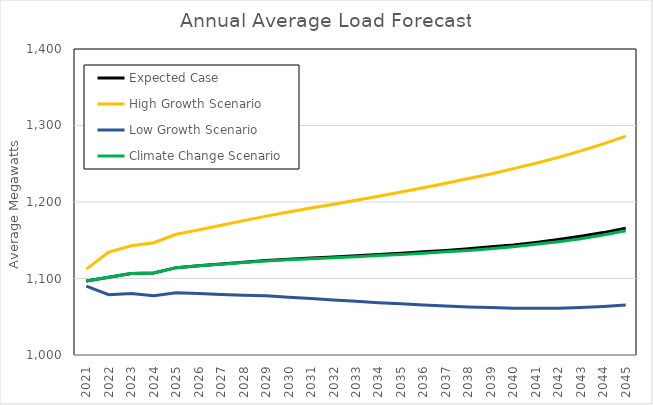
| Category | Expected Case | High Growth Scenario | Low Growth Scenario | Climate Change Scenario |
|---|---|---|---|---|
| 2021.0 | 1096.605 | 1112.304 | 1089.926 | 1096.605 |
| 2022.0 | 1101.688 | 1134.468 | 1078.847 | 1101.688 |
| 2023.0 | 1106.436 | 1142.803 | 1080.266 | 1106.436 |
| 2024.0 | 1107.288 | 1146.797 | 1077.345 | 1107.288 |
| 2025.0 | 1114.175 | 1157.879 | 1081.427 | 1114.175 |
| 2026.0 | 1116.586 | 1163.548 | 1080.351 | 1116.567 |
| 2027.0 | 1118.841 | 1169.551 | 1079.181 | 1118.652 |
| 2028.0 | 1121.088 | 1175.63 | 1078.263 | 1120.904 |
| 2029.0 | 1123.668 | 1181.551 | 1077.345 | 1122.989 |
| 2030.0 | 1125.175 | 1186.797 | 1075.515 | 1124.499 |
| 2031.0 | 1126.671 | 1192.129 | 1073.764 | 1125.833 |
| 2032.0 | 1128.167 | 1197.129 | 1072.016 | 1127.085 |
| 2033.0 | 1129.751 | 1202.378 | 1070.268 | 1128.422 |
| 2034.0 | 1131.252 | 1207.625 | 1068.433 | 1130.093 |
| 2035.0 | 1132.921 | 1213.041 | 1067.099 | 1131.427 |
| 2036.0 | 1134.836 | 1218.625 | 1065.348 | 1133.099 |
| 2037.0 | 1136.751 | 1224.46 | 1064.101 | 1134.94 |
| 2038.0 | 1138.915 | 1230.622 | 1062.849 | 1136.688 |
| 2039.0 | 1141.419 | 1236.625 | 1061.934 | 1139.03 |
| 2040.0 | 1143.918 | 1243.622 | 1061.268 | 1141.611 |
| 2041.0 | 1147.164 | 1250.625 | 1061.019 | 1144.619 |
| 2042.0 | 1150.912 | 1258.37 | 1061.101 | 1148.038 |
| 2043.0 | 1155.159 | 1266.786 | 1061.934 | 1152.038 |
| 2044.0 | 1159.997 | 1275.951 | 1063.348 | 1156.874 |
| 2045.0 | 1165.658 | 1286.118 | 1065.348 | 1162.293 |